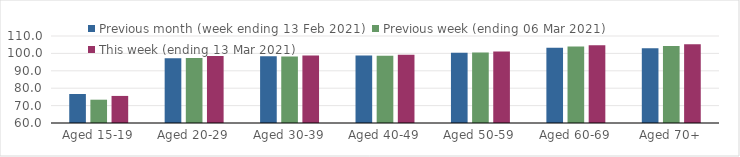
| Category | Previous month (week ending 13 Feb 2021) | Previous week (ending 06 Mar 2021) | This week (ending 13 Mar 2021) |
|---|---|---|---|
| Aged 15-19 | 76.66 | 73.39 | 75.56 |
| Aged 20-29 | 97.27 | 97.42 | 98.52 |
| Aged 30-39 | 98.4 | 98.18 | 98.78 |
| Aged 40-49 | 98.77 | 98.58 | 99.24 |
| Aged 50-59 | 100.34 | 100.46 | 101.08 |
| Aged 60-69 | 103.22 | 103.92 | 104.68 |
| Aged 70+ | 103 | 104.32 | 105.2 |